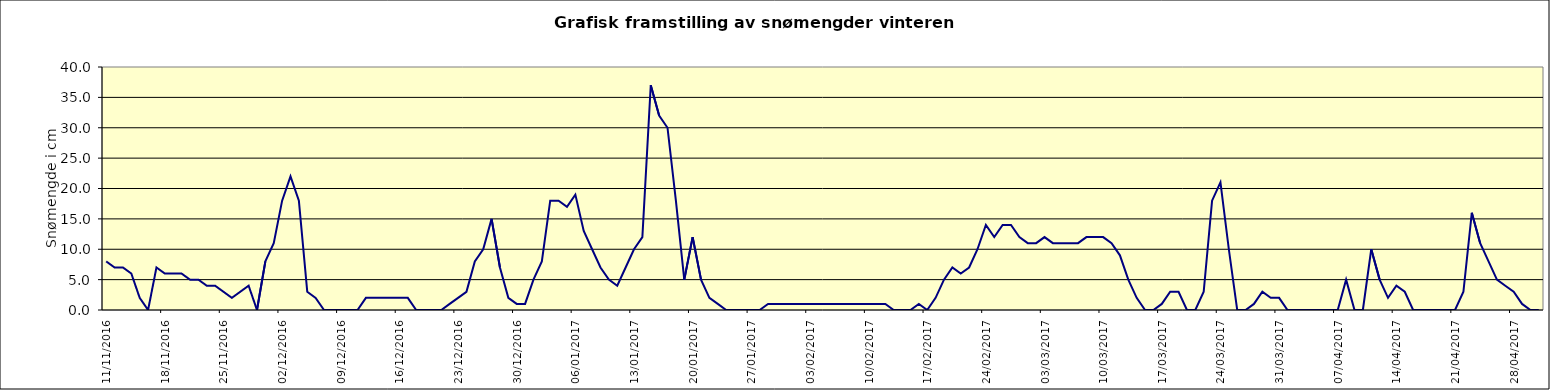
| Category | Series 0 |
|---|---|
| 11/11/2016 | 8 |
| 12/11/2016 | 7 |
| 13/11/2016 | 7 |
| 14/11/2016 | 6 |
| 15/11/2016 | 2 |
| 16/11/2016 | 0 |
| 17/11/2016 | 7 |
| 18/11/2016 | 6 |
| 19/11/2016 | 6 |
| 20/11/2016 | 6 |
| 21/11/2016 | 5 |
| 22/11/2016 | 5 |
| 23/11/2016 | 4 |
| 24/11/2016 | 4 |
| 25/11/2016 | 3 |
| 26/11/2016 | 2 |
| 27/11/2016 | 3 |
| 28/11/2016 | 4 |
| 29/11/2016 | 0 |
| 30/11/2016 | 8 |
| 01/12/2016 | 11 |
| 02/12/2016 | 18 |
| 03/12/2016 | 22 |
| 04/12/2016 | 18 |
| 05/12/2016 | 3 |
| 06/12/2016 | 2 |
| 07/12/2016 | 0 |
| 08/12/2016 | 0 |
| 09/12/2016 | 0 |
| 10/12/2016 | 0 |
| 11/12/2016 | 0 |
| 12/12/2016 | 2 |
| 13/12/2016 | 2 |
| 14/12/2016 | 2 |
| 15/12/2016 | 2 |
| 16/12/2016 | 2 |
| 17/12/2016 | 2 |
| 18/12/2016 | 0 |
| 19/12/2016 | 0 |
| 20/12/2016 | 0 |
| 21/12/2016 | 0 |
| 22/12/2016 | 1 |
| 23/12/2016 | 2 |
| 24/12/2016 | 3 |
| 25/12/2016 | 8 |
| 26/12/2016 | 10 |
| 27/12/2016 | 15 |
| 28/12/2016 | 7 |
| 29/12/2016 | 2 |
| 30/12/2016 | 1 |
| 31/12/2016 | 1 |
| 01/01/2017 | 5 |
| 02/01/2017 | 8 |
| 03/01/2017 | 18 |
| 04/01/2017 | 18 |
| 05/01/2017 | 17 |
| 06/01/2017 | 19 |
| 07/01/2017 | 13 |
| 08/01/2017 | 10 |
| 09/01/2017 | 7 |
| 10/01/2017 | 5 |
| 11/01/2017 | 4 |
| 12/01/2017 | 7 |
| 13/01/2017 | 10 |
| 14/01/2017 | 12 |
| 15/01/2017 | 37 |
| 16/01/2017 | 32 |
| 17/01/2017 | 30 |
| 18/01/2017 | 18 |
| 19/01/2017 | 5 |
| 20/01/2017 | 12 |
| 21/01/2017 | 5 |
| 22/01/2017 | 2 |
| 23/01/2017 | 1 |
| 24/01/2017 | 0 |
| 25/01/2017 | 0 |
| 26/01/2017 | 0 |
| 27/01/2017 | 0 |
| 28/01/2017 | 0 |
| 29/01/2017 | 1 |
| 30/01/2017 | 1 |
| 31/01/2017 | 1 |
| 01/02/2017 | 1 |
| 02/02/2017 | 1 |
| 03/02/2017 | 1 |
| 04/02/2017 | 1 |
| 05/02/2017 | 1 |
| 06/02/2017 | 1 |
| 07/02/2017 | 1 |
| 08/02/2017 | 1 |
| 09/02/2017 | 1 |
| 10/02/2017 | 1 |
| 11/02/2017 | 1 |
| 12/02/2017 | 1 |
| 13/02/2017 | 0 |
| 14/02/2017 | 0 |
| 15/02/2017 | 0 |
| 16/02/2017 | 1 |
| 17/02/2017 | 0 |
| 18/02/2017 | 2 |
| 19/02/2017 | 5 |
| 20/02/2017 | 7 |
| 21/02/2017 | 6 |
| 22/02/2017 | 7 |
| 23/02/2017 | 10 |
| 24/02/2017 | 14 |
| 25/02/2017 | 12 |
| 26/02/2017 | 14 |
| 27/02/2017 | 14 |
| 28/02/2017 | 12 |
| 01/03/2017 | 11 |
| 02/03/2017 | 11 |
| 03/03/2017 | 12 |
| 04/03/2017 | 11 |
| 05/03/2017 | 11 |
| 06/03/2017 | 11 |
| 07/03/2017 | 11 |
| 08/03/2017 | 12 |
| 09/03/2017 | 12 |
| 10/03/2017 | 12 |
| 11/03/2017 | 11 |
| 12/03/2017 | 9 |
| 13/03/2017 | 5 |
| 14/03/2017 | 2 |
| 15/03/2017 | 0 |
| 16/03/2017 | 0 |
| 17/03/2017 | 1 |
| 18/03/2017 | 3 |
| 19/03/2017 | 3 |
| 20/03/2017 | 0 |
| 21/03/2017 | 0 |
| 22/03/2017 | 3 |
| 23/03/2017 | 18 |
| 24/03/2017 | 21 |
| 25/03/2017 | 10 |
| 26/03/2017 | 0 |
| 27/03/2017 | 0 |
| 28/03/2017 | 1 |
| 29/03/2017 | 3 |
| 30/03/2017 | 2 |
| 31/03/2017 | 2 |
| 01/04/2017 | 0 |
| 02/04/2017 | 0 |
| 03/04/2017 | 0 |
| 04/04/2017 | 0 |
| 05/04/2017 | 0 |
| 06/04/2017 | 0 |
| 07/04/2017 | 0 |
| 08/04/2017 | 5 |
| 09/04/2017 | 0 |
| 10/04/2017 | 0 |
| 11/04/2017 | 10 |
| 12/04/2017 | 5 |
| 13/04/2017 | 2 |
| 14/04/2017 | 4 |
| 15/04/2017 | 3 |
| 16/04/2017 | 0 |
| 17/04/2017 | 0 |
| 18/04/2017 | 0 |
| 19/04/2017 | 0 |
| 20/04/2017 | 0 |
| 21/04/2017 | 0 |
| 22/04/2017 | 3 |
| 23/04/2017 | 16 |
| 24/04/2017 | 11 |
| 25/04/2017 | 8 |
| 26/04/2017 | 5 |
| 27/04/2017 | 4 |
| 28/04/2017 | 3 |
| 29/04/2017 | 1 |
| 30/04/2017 | 0 |
| 01/05/2017 | 0 |